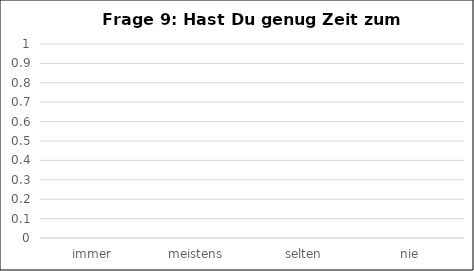
| Category | Series 0 |
|---|---|
| immer | 0 |
| meistens  | 0 |
| selten | 0 |
| nie | 0 |